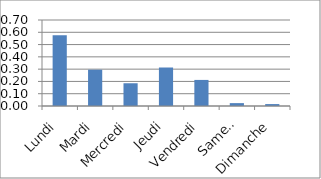
| Category | Series 0 |
|---|---|
| Lundi | 0.576 |
| Mardi | 0.295 |
| Mercredi | 0.185 |
| Jeudi | 0.313 |
| Vendredi | 0.212 |
| Samedi | 0.023 |
| Dimanche | 0.016 |